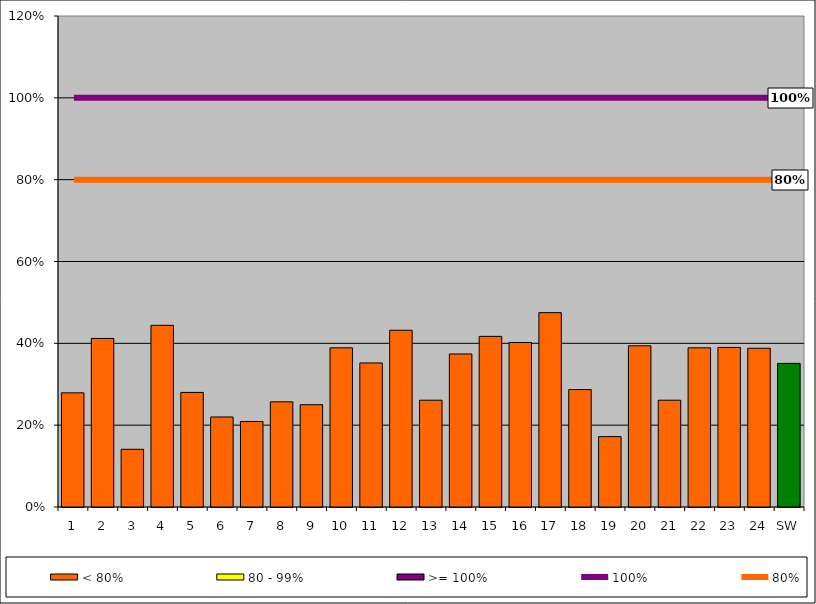
| Category | < 80% | 80 - 99% | >= 100% |
|---|---|---|---|
| 1 | 0.279 | 0 | 0 |
| 2 | 0.412 | 0 | 0 |
| 3 | 0.141 | 0 | 0 |
| 4 | 0.444 | 0 | 0 |
| 5 | 0.28 | 0 | 0 |
| 6 | 0.22 | 0 | 0 |
| 7 | 0.209 | 0 | 0 |
| 8 | 0.257 | 0 | 0 |
| 9 | 0.25 | 0 | 0 |
| 10 | 0.389 | 0 | 0 |
| 11 | 0.352 | 0 | 0 |
| 12 | 0.432 | 0 | 0 |
| 13 | 0.261 | 0 | 0 |
| 14 | 0.374 | 0 | 0 |
| 15 | 0.417 | 0 | 0 |
| 16 | 0.402 | 0 | 0 |
| 17 | 0.475 | 0 | 0 |
| 18 | 0.287 | 0 | 0 |
| 19 | 0.172 | 0 | 0 |
| 20 | 0.394 | 0 | 0 |
| 21 | 0.261 | 0 | 0 |
| 22 | 0.389 | 0 | 0 |
| 23 | 0.39 | 0 | 0 |
| 24 | 0.388 | 0 | 0 |
| SW | 0.351 | 0 | 0 |